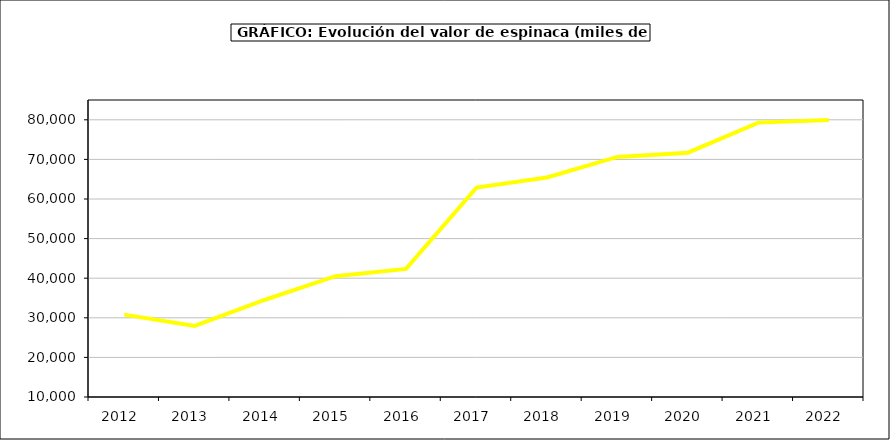
| Category | Valor |
|---|---|
| 2012.0 | 30801.916 |
| 2013.0 | 27951.792 |
| 2014.0 | 34558.726 |
| 2015.0 | 40502 |
| 2016.0 | 42355 |
| 2017.0 | 62868.236 |
| 2018.0 | 65435.978 |
| 2019.0 | 70628.986 |
| 2020.0 | 71691.2 |
| 2021.0 | 79290.147 |
| 2022.0 | 79974.362 |